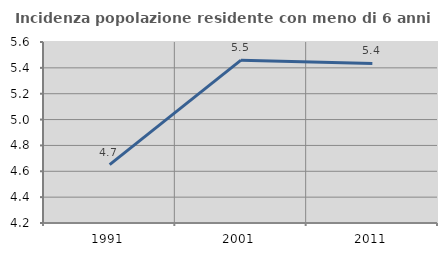
| Category | Incidenza popolazione residente con meno di 6 anni |
|---|---|
| 1991.0 | 4.651 |
| 2001.0 | 5.46 |
| 2011.0 | 5.434 |